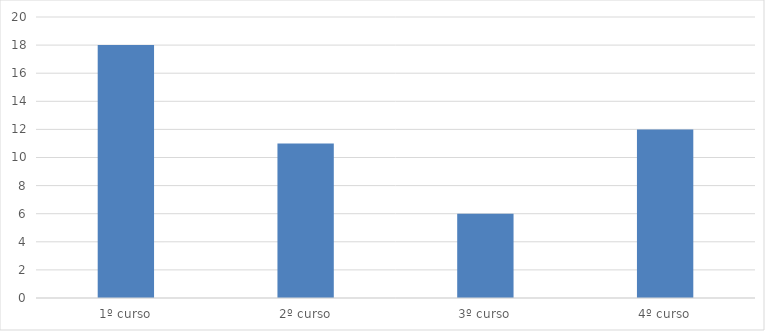
| Category | Series 0 |
|---|---|
| 1º curso | 18 |
| 2º curso | 11 |
| 3º curso | 6 |
| 4º curso | 12 |